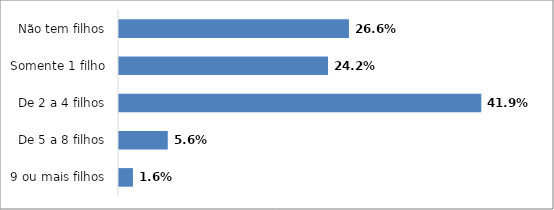
| Category | Series 0 |
|---|---|
| 9 ou mais filhos | 0.016 |
| De 5 a 8 filhos | 0.056 |
| De 2 a 4 filhos | 0.419 |
| Somente 1 filho | 0.242 |
| Não tem filhos | 0.266 |